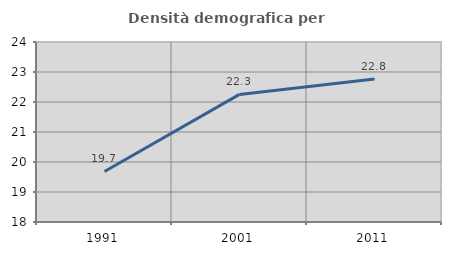
| Category | Densità demografica |
|---|---|
| 1991.0 | 19.686 |
| 2001.0 | 22.253 |
| 2011.0 | 22.767 |